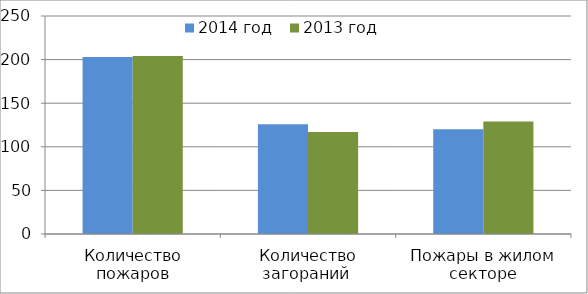
| Category | 2014 год | 2013 год |
|---|---|---|
| Количество пожаров | 203 | 204 |
| Количество загораний  | 126 | 117 |
| Пожары в жилом секторе | 120 | 129 |